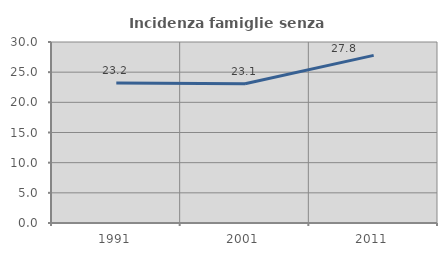
| Category | Incidenza famiglie senza nuclei |
|---|---|
| 1991.0 | 23.211 |
| 2001.0 | 23.095 |
| 2011.0 | 27.778 |